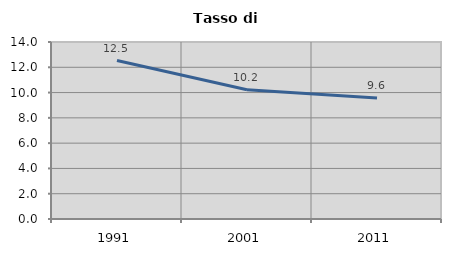
| Category | Tasso di disoccupazione   |
|---|---|
| 1991.0 | 12.533 |
| 2001.0 | 10.227 |
| 2011.0 | 9.569 |